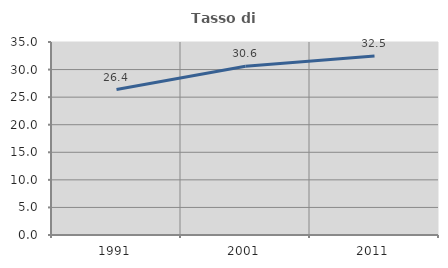
| Category | Tasso di occupazione   |
|---|---|
| 1991.0 | 26.384 |
| 2001.0 | 30.62 |
| 2011.0 | 32.479 |